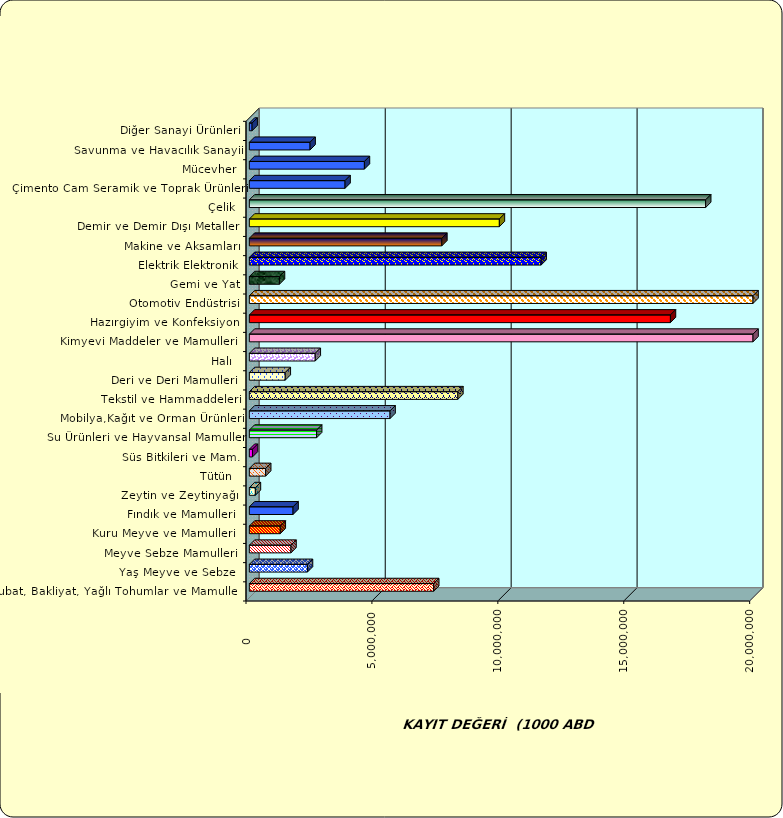
| Category | Series 0 |
|---|---|
|  Hububat, Bakliyat, Yağlı Tohumlar ve Mamulleri  | 7319640.878 |
|  Yaş Meyve ve Sebze   | 2307244.199 |
|  Meyve Sebze Mamulleri  | 1652695.74 |
|  Kuru Meyve ve Mamulleri   | 1227096.615 |
|  Fındık ve Mamulleri  | 1735030.714 |
|  Zeytin ve Zeytinyağı  | 239306.809 |
|  Tütün  | 647684.712 |
|  Süs Bitkileri ve Mam. | 124296.651 |
|  Su Ürünleri ve Hayvansal Mamuller | 2671342.296 |
|  Mobilya,Kağıt ve Orman Ürünleri | 5587267.845 |
|  Tekstil ve Hammaddeleri | 8278911.344 |
|  Deri ve Deri Mamulleri  | 1425874.541 |
|  Halı  | 2616800.381 |
|  Kimyevi Maddeler ve Mamulleri   | 20535462.874 |
|  Hazırgiyim ve Konfeksiyon  | 16720208.537 |
|  Otomotiv Endüstrisi | 23852902.649 |
|  Gemi ve Yat | 1195418.819 |
|  Elektrik Elektronik | 11586647.228 |
|  Makine ve Aksamları | 7642821.09 |
|  Demir ve Demir Dışı Metaller  | 9927549.415 |
|  Çelik | 18119107.185 |
|  Çimento Cam Seramik ve Toprak Ürünleri | 3800029.09 |
|  Mücevher | 4569104.74 |
|  Savunma ve Havacılık Sanayii | 2410927.677 |
|  Diğer Sanayi Ürünleri | 108670.366 |